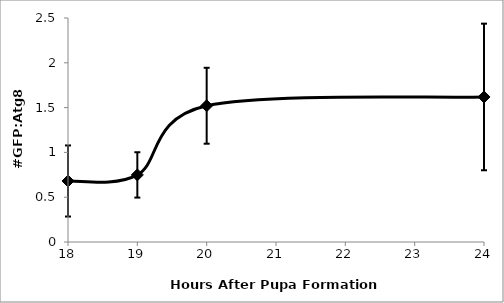
| Category | Series 0 |
|---|---|
| 18.0 | 0.681 |
| 19.0 | 0.749 |
| 20.0 | 1.521 |
| 24.0 | 1.619 |